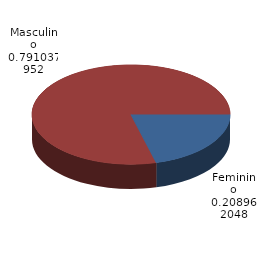
| Category | Qtde Vítimas |
|---|---|
| Feminino | 457 |
| Masculino | 1730 |